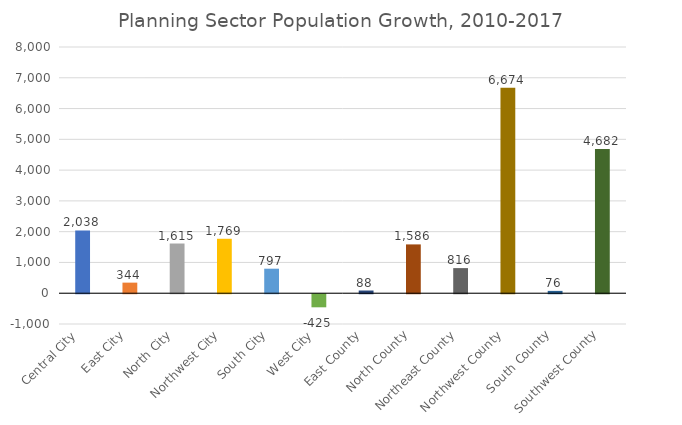
| Category | Total population |
|---|---|
| Central City  | 2038 |
| East City  | 344 |
| North City  | 1615 |
| Northwest City  | 1769 |
| South City  | 797 |
| West City  | -425 |
| East County  | 88 |
| North County  | 1586 |
| Northeast County  | 816 |
| Northwest County  | 6674 |
| South County  | 76 |
| Southwest County  | 4682 |